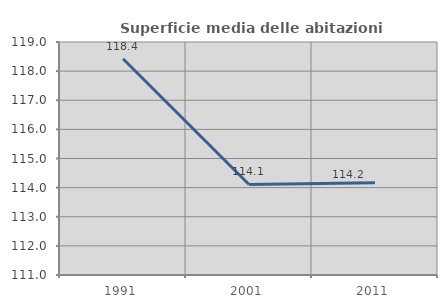
| Category | Superficie media delle abitazioni occupate |
|---|---|
| 1991.0 | 118.423 |
| 2001.0 | 114.109 |
| 2011.0 | 114.17 |